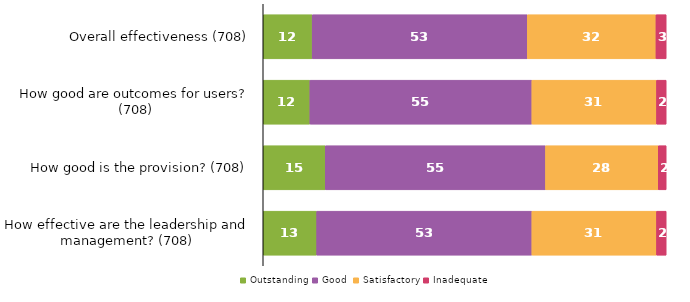
| Category | Outstanding | Good | Satisfactory | Inadequate |
|---|---|---|---|---|
| Overall effectiveness (708) | 12.147 | 53.39 | 31.921 | 2.542 |
| How good are outcomes for users? (708) | 11.582 | 55.085 | 30.932 | 2.401 |
| How good is the provision? (708) | 15.395 | 54.661 | 27.966 | 1.977 |
| How effective are the leadership and management? (708) | 13.277 | 53.39 | 30.932 | 2.401 |